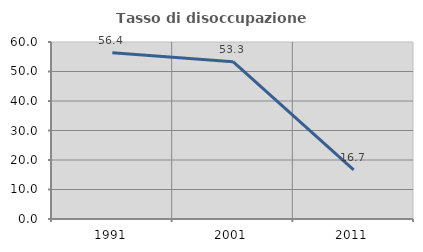
| Category | Tasso di disoccupazione giovanile  |
|---|---|
| 1991.0 | 56.364 |
| 2001.0 | 53.333 |
| 2011.0 | 16.667 |